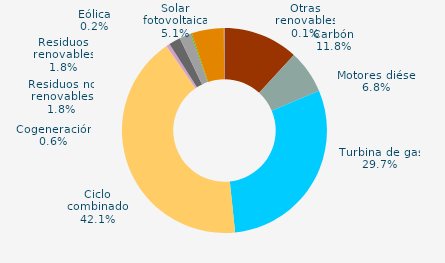
| Category | Series 0 |
|---|---|
| Carbón | 11.827 |
| Motores diésel | 6.835 |
| Turbina de gas | 29.686 |
| Ciclo combinado | 42.069 |
| Generación auxiliar | 0 |
| Cogeneración | 0.565 |
| Residuos no renovables | 1.834 |
| Residuos renovables | 1.834 |
| Eólica | 0.178 |
| Solar fotovoltaica | 5.067 |
| Otras renovables | 0.104 |